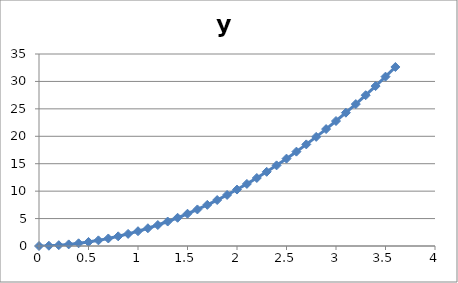
| Category | y m |
|---|---|
| 0.0 | 0 |
| 0.1 | 0.049 |
| 0.2 | 0.147 |
| 0.3 | 0.294 |
| 0.4 | 0.49 |
| 0.5 | 0.735 |
| 0.6 | 1.029 |
| 0.7 | 1.372 |
| 0.8 | 1.764 |
| 0.9 | 2.205 |
| 1.0 | 2.695 |
| 1.1 | 3.234 |
| 1.2 | 3.822 |
| 1.3 | 4.459 |
| 1.4 | 5.145 |
| 1.5 | 5.88 |
| 1.6 | 6.664 |
| 1.7 | 7.497 |
| 1.8 | 8.379 |
| 1.9 | 9.31 |
| 2.0 | 10.29 |
| 2.1 | 11.319 |
| 2.2 | 12.397 |
| 2.3 | 13.524 |
| 2.4 | 14.7 |
| 2.5 | 15.925 |
| 2.6 | 17.199 |
| 2.7 | 18.522 |
| 2.8 | 19.894 |
| 2.9 | 21.315 |
| 3.0 | 22.785 |
| 3.1 | 24.304 |
| 3.2 | 25.872 |
| 3.3 | 27.489 |
| 3.4 | 29.155 |
| 3.5 | 30.87 |
| 3.6 | 32.634 |